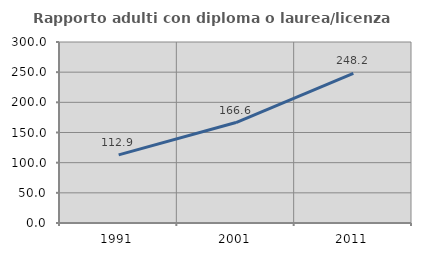
| Category | Rapporto adulti con diploma o laurea/licenza media  |
|---|---|
| 1991.0 | 112.941 |
| 2001.0 | 166.556 |
| 2011.0 | 248.18 |